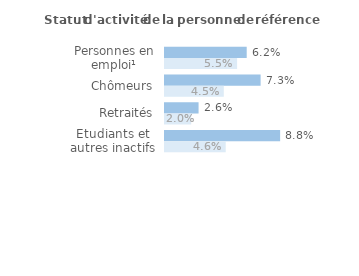
| Category | Series 1 | Series 0 |
|---|---|---|
| Personnes en emploi¹ | 0.062 | 0.055 |
| Chômeurs | 0.073 | 0.045 |
| Retraités | 0.026 | 0.02 |
| Etudiants et autres inactifs | 0.088 | 0.046 |